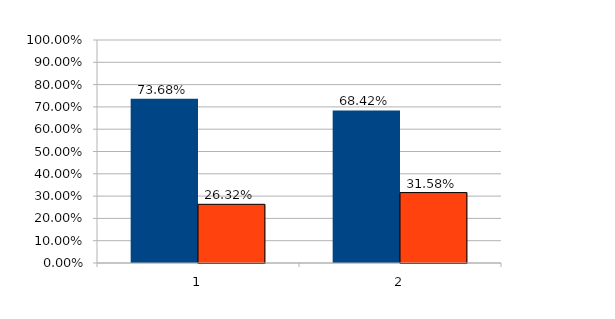
| Category | Series 0 | Series 1 |
|---|---|---|
| 0 | 0.737 | 0.263 |
| 1 | 0.684 | 0.316 |